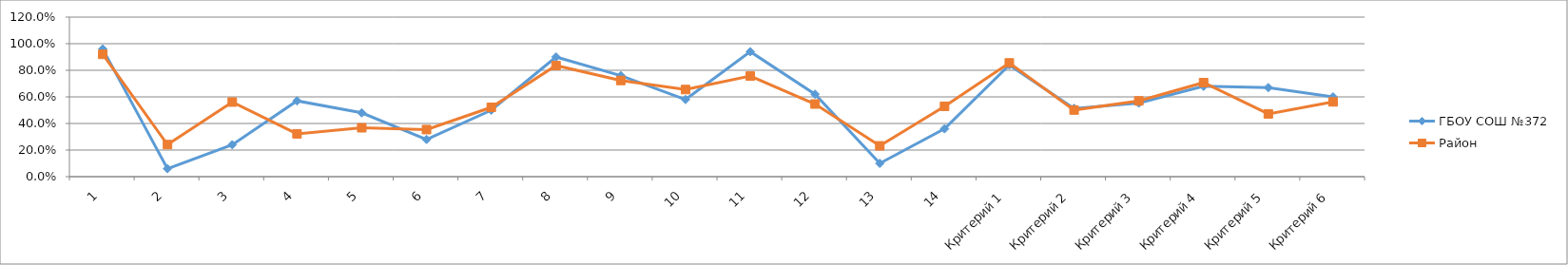
| Category | ГБОУ СОШ №372 | Район |
|---|---|---|
| 1 | 0.96 | 0.92 |
| 2 | 0.06 | 0.241 |
| 3 | 0.24 | 0.561 |
| 4 | 0.57 | 0.322 |
| 5 | 0.48 | 0.368 |
| 6 | 0.28 | 0.354 |
| 7 | 0.5 | 0.521 |
| 8 | 0.9 | 0.836 |
| 9 | 0.76 | 0.723 |
| 10 | 0.58 | 0.655 |
| 11 | 0.94 | 0.756 |
| 12 | 0.62 | 0.546 |
| 13 | 0.1 | 0.232 |
| 14 | 0.36 | 0.529 |
| Критерий 1 | 0.84 | 0.855 |
| Критерий 2 | 0.513 | 0.501 |
| Критерий 3 | 0.553 | 0.57 |
| Критерий 4 | 0.68 | 0.707 |
| Критерий 5 | 0.67 | 0.472 |
| Критерий 6 | 0.6 | 0.562 |